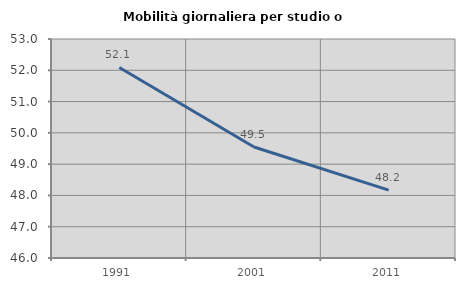
| Category | Mobilità giornaliera per studio o lavoro |
|---|---|
| 1991.0 | 52.09 |
| 2001.0 | 49.549 |
| 2011.0 | 48.169 |